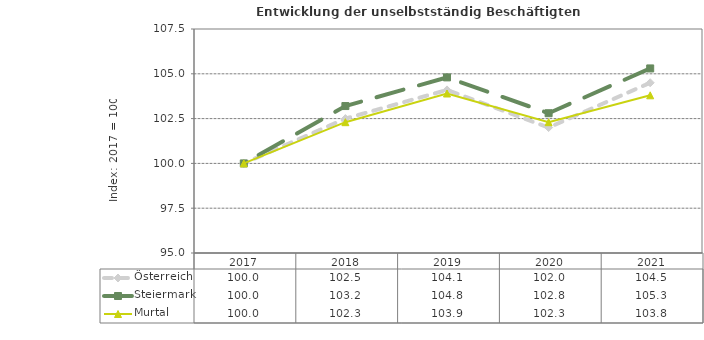
| Category | Österreich | Steiermark | Murtal |
|---|---|---|---|
| 2021.0 | 104.5 | 105.3 | 103.8 |
| 2020.0 | 102 | 102.8 | 102.3 |
| 2019.0 | 104.1 | 104.8 | 103.9 |
| 2018.0 | 102.5 | 103.2 | 102.3 |
| 2017.0 | 100 | 100 | 100 |